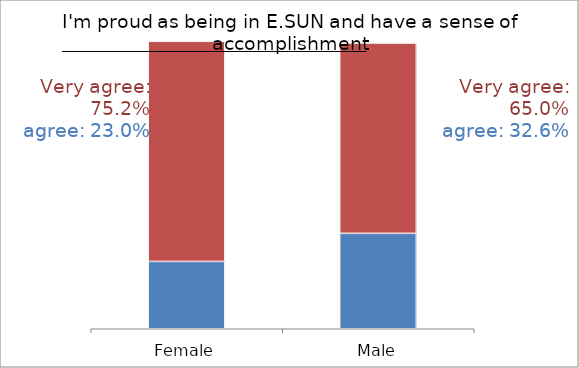
| Category | Agree | Very Agree | Neutral | Very Disagree |
|---|---|---|---|---|
| Female | 663 | 2168 | 44 | 1 |
| Male | 1070 | 2134 | 70 | 0 |